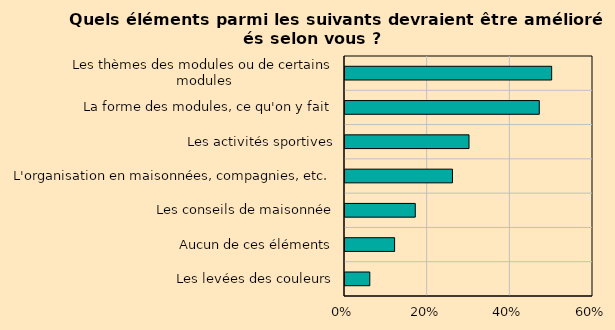
| Category | Series 0 |
|---|---|
| Les levées des couleurs | 0.06 |
| Aucun de ces éléments | 0.12 |
| Les conseils de maisonnée | 0.17 |
| L'organisation en maisonnées, compagnies, etc. | 0.26 |
| Les activités sportives | 0.3 |
| La forme des modules, ce qu'on y fait | 0.47 |
| Les thèmes des modules ou de certains modules | 0.5 |